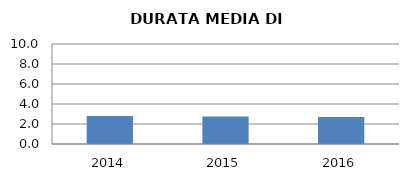
| Category | 2014 2015 2016 |
|---|---|
| 2014.0 | 2.79 |
| 2015.0 | 2.762 |
| 2016.0 | 2.696 |